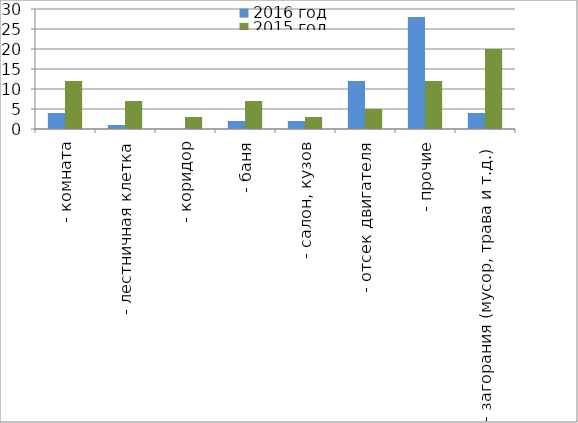
| Category | 2016 год | 2015 год |
|---|---|---|
|  - комната | 4 | 12 |
|  - лестничная клетка | 1 | 7 |
|  - коридор | 0 | 3 |
|  - баня | 2 | 7 |
|  - салон, кузов | 2 | 3 |
|  - отсек двигателя | 12 | 5 |
| - прочие | 28 | 12 |
| - загорания (мусор, трава и т.д.)  | 4 | 20 |